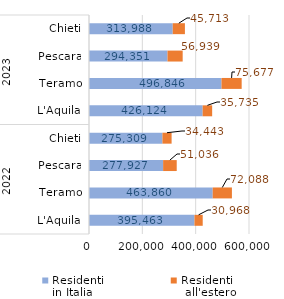
| Category | Residenti 
in Italia | Residenti
 all'estero |
|---|---|---|
| 0 | 395463 | 30968 |
| 1 | 463860 | 72088 |
| 2 | 277927 | 51036 |
| 3 | 275309 | 34443 |
| 4 | 426124 | 35735 |
| 5 | 496846 | 75677 |
| 6 | 294351 | 56939 |
| 7 | 313988 | 45713 |